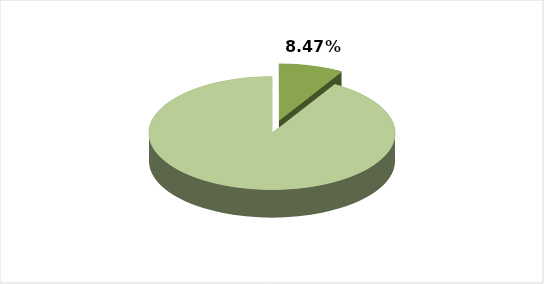
| Category | Series 0 |
|---|---|
| 0 | 0.085 |
| 1 | 0.915 |